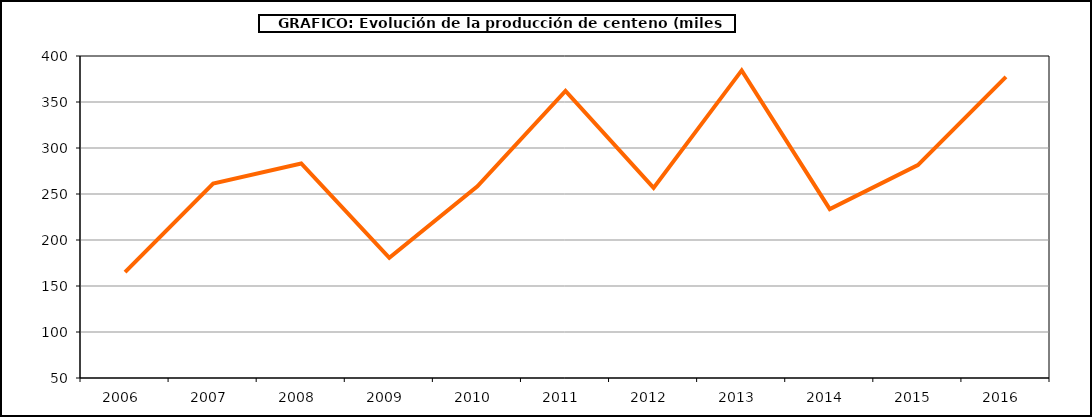
| Category | Producción |
|---|---|
| 2006.0 | 164.997 |
| 2007.0 | 261.369 |
| 2008.0 | 283.212 |
| 2009.0 | 180.666 |
| 2010.0 | 258.38 |
| 2011.0 | 362.08 |
| 2012.0 | 256.675 |
| 2013.0 | 384.339 |
| 2014.0 | 233.542 |
| 2015.0 | 281.366 |
| 2016.0 | 377.355 |